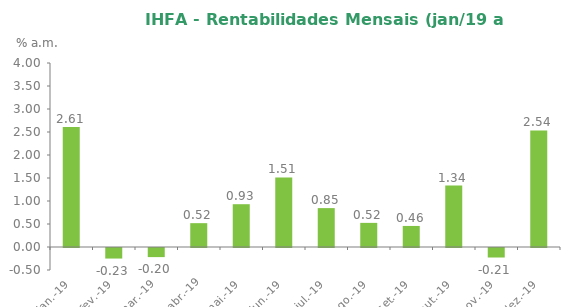
| Category | Variação no Mês |
|---|---|
| 2019-01-31 | 2.611 |
| 2019-02-28 | -0.229 |
| 2019-03-29 | -0.198 |
| 2019-04-30 | 0.518 |
| 2019-05-31 | 0.93 |
| 2019-06-28 | 1.513 |
| 2019-07-31 | 0.845 |
| 2019-08-30 | 0.524 |
| 2019-09-30 | 0.458 |
| 2019-10-31 | 1.337 |
| 2019-11-29 | -0.207 |
| 2019-12-31 | 2.535 |